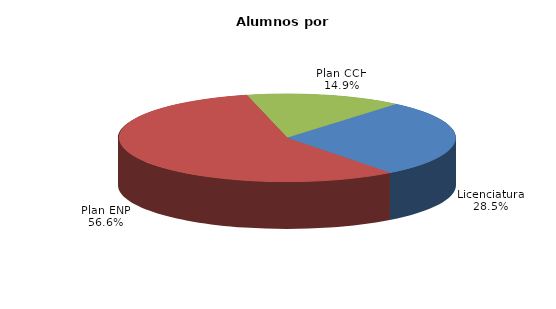
| Category | Series 0 |
|---|---|
| Licenciatura | 21338 |
| Plan ENP | 42369 |
| Plan CCH | 11186 |